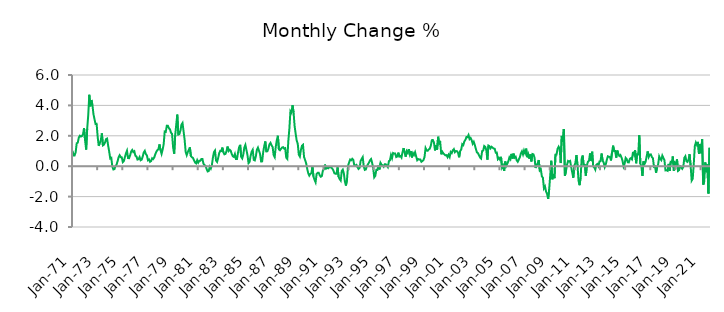
| Category | Series 0 |
|---|---|
| 1971-01-01 | 1.014 |
| 1971-02-01 | 0.711 |
| 1971-03-01 | 0.712 |
| 1971-04-01 | 0.919 |
| 1971-05-01 | 1.51 |
| 1971-06-01 | 1.551 |
| 1971-07-01 | 1.878 |
| 1971-08-01 | 2.005 |
| 1971-09-01 | 1.95 |
| 1971-10-01 | 1.987 |
| 1971-11-01 | 2.104 |
| 1971-12-01 | 2.509 |
| 1972-01-01 | 1.699 |
| 1972-02-01 | 1.094 |
| 1972-03-01 | 2.462 |
| 1972-04-01 | 3.36 |
| 1972-05-01 | 4.697 |
| 1972-06-01 | 3.937 |
| 1972-07-01 | 4.355 |
| 1972-08-01 | 4.026 |
| 1972-09-01 | 3.417 |
| 1972-10-01 | 3.088 |
| 1972-11-01 | 2.774 |
| 1972-12-01 | 2.784 |
| 1973-01-01 | 1.938 |
| 1973-02-01 | 1.343 |
| 1973-03-01 | 1.524 |
| 1973-04-01 | 1.712 |
| 1973-05-01 | 2.158 |
| 1973-06-01 | 1.373 |
| 1973-07-01 | 1.418 |
| 1973-08-01 | 1.551 |
| 1973-09-01 | 1.782 |
| 1973-10-01 | 1.816 |
| 1973-11-01 | 1.359 |
| 1973-12-01 | 0.961 |
| 1974-01-01 | 0.511 |
| 1974-02-01 | 0.548 |
| 1974-03-01 | -0.022 |
| 1974-04-01 | -0.216 |
| 1974-05-01 | -0.191 |
| 1974-06-01 | 0.007 |
| 1974-07-01 | 0.097 |
| 1974-08-01 | 0.326 |
| 1974-09-01 | 0.591 |
| 1974-10-01 | 0.722 |
| 1974-11-01 | 0.594 |
| 1974-12-01 | 0.583 |
| 1975-01-01 | 0.268 |
| 1975-02-01 | 0.337 |
| 1975-03-01 | 0.597 |
| 1975-04-01 | 0.845 |
| 1975-05-01 | 1.017 |
| 1975-06-01 | 0.539 |
| 1975-07-01 | 0.526 |
| 1975-08-01 | 0.722 |
| 1975-09-01 | 0.97 |
| 1975-10-01 | 1.067 |
| 1975-11-01 | 0.93 |
| 1975-12-01 | 0.985 |
| 1976-01-01 | 0.687 |
| 1976-02-01 | 0.643 |
| 1976-03-01 | 0.437 |
| 1976-04-01 | 0.463 |
| 1976-05-01 | 0.603 |
| 1976-06-01 | 0.392 |
| 1976-07-01 | 0.432 |
| 1976-08-01 | 0.636 |
| 1976-09-01 | 0.905 |
| 1976-10-01 | 1.011 |
| 1976-11-01 | 0.8 |
| 1976-12-01 | 0.709 |
| 1977-01-01 | 0.392 |
| 1977-02-01 | 0.448 |
| 1977-03-01 | 0.289 |
| 1977-04-01 | 0.338 |
| 1977-05-01 | 0.521 |
| 1977-06-01 | 0.47 |
| 1977-07-01 | 0.575 |
| 1977-08-01 | 0.784 |
| 1977-09-01 | 0.951 |
| 1977-10-01 | 1.061 |
| 1977-11-01 | 1.111 |
| 1977-12-01 | 1.434 |
| 1978-01-01 | 1.05 |
| 1978-02-01 | 0.811 |
| 1978-03-01 | 1.084 |
| 1978-04-01 | 1.443 |
| 1978-05-01 | 2.28 |
| 1978-06-01 | 2.255 |
| 1978-07-01 | 2.668 |
| 1978-08-01 | 2.665 |
| 1978-09-01 | 2.498 |
| 1978-10-01 | 2.424 |
| 1978-11-01 | 2.207 |
| 1978-12-01 | 2.133 |
| 1979-01-01 | 1.242 |
| 1979-02-01 | 0.823 |
| 1979-03-01 | 2.034 |
| 1979-04-01 | 2.732 |
| 1979-05-01 | 3.394 |
| 1979-06-01 | 2.083 |
| 1979-07-01 | 2.118 |
| 1979-08-01 | 2.335 |
| 1979-09-01 | 2.734 |
| 1979-10-01 | 2.841 |
| 1979-11-01 | 2.3 |
| 1979-12-01 | 1.747 |
| 1980-01-01 | 0.943 |
| 1980-02-01 | 0.726 |
| 1980-03-01 | 0.925 |
| 1980-04-01 | 1.073 |
| 1980-05-01 | 1.242 |
| 1980-06-01 | 0.656 |
| 1980-07-01 | 0.591 |
| 1980-08-01 | 0.543 |
| 1980-09-01 | 0.381 |
| 1980-10-01 | 0.243 |
| 1980-11-01 | 0.186 |
| 1980-12-01 | 0.395 |
| 1981-01-01 | 0.234 |
| 1981-02-01 | 0.354 |
| 1981-03-01 | 0.354 |
| 1981-04-01 | 0.474 |
| 1981-05-01 | 0.478 |
| 1981-06-01 | 0.161 |
| 1981-07-01 | 0.077 |
| 1981-08-01 | 0.019 |
| 1981-09-01 | -0.188 |
| 1981-10-01 | -0.344 |
| 1981-11-01 | -0.317 |
| 1981-12-01 | -0.035 |
| 1982-01-01 | -0.155 |
| 1982-02-01 | 0.068 |
| 1982-03-01 | 0.555 |
| 1982-04-01 | 0.929 |
| 1982-05-01 | 1.031 |
| 1982-06-01 | 0.372 |
| 1982-07-01 | 0.28 |
| 1982-08-01 | 0.532 |
| 1982-09-01 | 0.859 |
| 1982-10-01 | 1.012 |
| 1982-11-01 | 0.998 |
| 1982-12-01 | 1.225 |
| 1983-01-01 | 0.92 |
| 1983-02-01 | 0.783 |
| 1983-03-01 | 0.81 |
| 1983-04-01 | 0.995 |
| 1983-05-01 | 1.293 |
| 1983-06-01 | 1.001 |
| 1983-07-01 | 1.08 |
| 1983-08-01 | 1.015 |
| 1983-09-01 | 0.803 |
| 1983-10-01 | 0.652 |
| 1983-11-01 | 0.611 |
| 1983-12-01 | 0.798 |
| 1984-01-01 | 0.473 |
| 1984-02-01 | 0.478 |
| 1984-03-01 | 0.903 |
| 1984-04-01 | 1.241 |
| 1984-05-01 | 1.404 |
| 1984-06-01 | 0.614 |
| 1984-07-01 | 0.511 |
| 1984-08-01 | 0.774 |
| 1984-09-01 | 1.225 |
| 1984-10-01 | 1.401 |
| 1984-11-01 | 1.068 |
| 1984-12-01 | 0.734 |
| 1985-01-01 | 0.202 |
| 1985-02-01 | 0.279 |
| 1985-03-01 | 0.684 |
| 1985-04-01 | 0.954 |
| 1985-05-01 | 1.079 |
| 1985-06-01 | 0.413 |
| 1985-07-01 | 0.38 |
| 1985-08-01 | 0.656 |
| 1985-09-01 | 1.087 |
| 1985-10-01 | 1.228 |
| 1985-11-01 | 1.02 |
| 1985-12-01 | 0.807 |
| 1986-01-01 | 0.311 |
| 1986-02-01 | 0.317 |
| 1986-03-01 | 0.923 |
| 1986-04-01 | 1.322 |
| 1986-05-01 | 1.629 |
| 1986-06-01 | 0.97 |
| 1986-07-01 | 0.982 |
| 1986-08-01 | 1.161 |
| 1986-09-01 | 1.443 |
| 1986-10-01 | 1.536 |
| 1986-11-01 | 1.373 |
| 1986-12-01 | 1.263 |
| 1987-01-01 | 0.724 |
| 1987-02-01 | 0.595 |
| 1987-03-01 | 1.283 |
| 1987-04-01 | 1.705 |
| 1987-05-01 | 2.003 |
| 1987-06-01 | 1.108 |
| 1987-07-01 | 1.049 |
| 1987-08-01 | 1.142 |
| 1987-09-01 | 1.226 |
| 1987-10-01 | 1.253 |
| 1987-11-01 | 1.16 |
| 1987-12-01 | 1.188 |
| 1988-01-01 | 0.558 |
| 1988-02-01 | 0.478 |
| 1988-03-01 | 1.666 |
| 1988-04-01 | 2.466 |
| 1988-05-01 | 3.62 |
| 1988-06-01 | 3.526 |
| 1988-07-01 | 4.01 |
| 1988-08-01 | 3.546 |
| 1988-09-01 | 2.637 |
| 1988-10-01 | 2.133 |
| 1988-11-01 | 1.68 |
| 1988-12-01 | 1.467 |
| 1989-01-01 | 0.756 |
| 1989-02-01 | 0.634 |
| 1989-03-01 | 1.069 |
| 1989-04-01 | 1.347 |
| 1989-05-01 | 1.408 |
| 1989-06-01 | 0.607 |
| 1989-07-01 | 0.411 |
| 1989-08-01 | 0.192 |
| 1989-09-01 | -0.165 |
| 1989-10-01 | -0.462 |
| 1989-11-01 | -0.618 |
| 1989-12-01 | -0.507 |
| 1990-01-01 | -0.459 |
| 1990-02-01 | -0.019 |
| 1990-03-01 | -0.686 |
| 1990-04-01 | -0.897 |
| 1990-05-01 | -1.058 |
| 1990-06-01 | -0.51 |
| 1990-07-01 | -0.437 |
| 1990-08-01 | -0.428 |
| 1990-09-01 | -0.604 |
| 1990-10-01 | -0.695 |
| 1990-11-01 | -0.649 |
| 1990-12-01 | -0.278 |
| 1991-01-01 | -0.196 |
| 1991-02-01 | 0.105 |
| 1991-03-01 | -0.159 |
| 1991-04-01 | -0.105 |
| 1991-05-01 | -0.139 |
| 1991-06-01 | -0.062 |
| 1991-07-01 | -0.066 |
| 1991-08-01 | -0.093 |
| 1991-09-01 | -0.159 |
| 1991-10-01 | -0.285 |
| 1991-11-01 | -0.467 |
| 1991-12-01 | -0.497 |
| 1992-01-01 | -0.494 |
| 1992-02-01 | -0.076 |
| 1992-03-01 | -0.697 |
| 1992-04-01 | -0.848 |
| 1992-05-01 | -0.944 |
| 1992-06-01 | -0.312 |
| 1992-07-01 | -0.225 |
| 1992-08-01 | -0.473 |
| 1992-09-01 | -1.015 |
| 1992-10-01 | -1.272 |
| 1992-11-01 | -0.873 |
| 1992-12-01 | 0.026 |
| 1993-01-01 | 0.247 |
| 1993-02-01 | 0.437 |
| 1993-03-01 | 0.391 |
| 1993-04-01 | 0.487 |
| 1993-05-01 | 0.413 |
| 1993-06-01 | 0.047 |
| 1993-07-01 | 0.03 |
| 1993-08-01 | 0.082 |
| 1993-09-01 | -0.063 |
| 1993-10-01 | -0.18 |
| 1993-11-01 | -0.118 |
| 1993-12-01 | 0.35 |
| 1994-01-01 | 0.48 |
| 1994-02-01 | 0.595 |
| 1994-03-01 | -0.023 |
| 1994-04-01 | -0.241 |
| 1994-05-01 | -0.212 |
| 1994-06-01 | 0.019 |
| 1994-07-01 | 0.12 |
| 1994-08-01 | 0.247 |
| 1994-09-01 | 0.391 |
| 1994-10-01 | 0.472 |
| 1994-11-01 | 0.222 |
| 1994-12-01 | -0.131 |
| 1995-01-01 | -0.733 |
| 1995-02-01 | -0.635 |
| 1995-03-01 | -0.24 |
| 1995-04-01 | -0.251 |
| 1995-05-01 | 0.043 |
| 1995-06-01 | -0.212 |
| 1995-07-01 | 0.218 |
| 1995-08-01 | 0.097 |
| 1995-09-01 | 0.057 |
| 1995-10-01 | -0.036 |
| 1995-11-01 | 0.126 |
| 1995-12-01 | 0.123 |
| 1996-01-01 | 0.036 |
| 1996-02-01 | -0.061 |
| 1996-03-01 | 0.33 |
| 1996-04-01 | 0.389 |
| 1996-05-01 | 0.736 |
| 1996-06-01 | 0.535 |
| 1996-07-01 | 0.868 |
| 1996-08-01 | 0.833 |
| 1996-09-01 | 0.834 |
| 1996-10-01 | 0.603 |
| 1996-11-01 | 0.635 |
| 1996-12-01 | 0.892 |
| 1997-01-01 | 0.634 |
| 1997-02-01 | 0.672 |
| 1997-03-01 | 0.57 |
| 1997-04-01 | 0.919 |
| 1997-05-01 | 1.19 |
| 1997-06-01 | 0.893 |
| 1997-07-01 | 0.625 |
| 1997-08-01 | 0.99 |
| 1997-09-01 | 0.877 |
| 1997-10-01 | 1.126 |
| 1997-11-01 | 0.779 |
| 1997-12-01 | 0.981 |
| 1998-01-01 | 0.576 |
| 1998-02-01 | 0.861 |
| 1998-03-01 | 0.744 |
| 1998-04-01 | 0.917 |
| 1998-05-01 | 0.646 |
| 1998-06-01 | 0.394 |
| 1998-07-01 | 0.47 |
| 1998-08-01 | 0.438 |
| 1998-09-01 | 0.441 |
| 1998-10-01 | 0.291 |
| 1998-11-01 | 0.339 |
| 1998-12-01 | 0.406 |
| 1999-01-01 | 0.599 |
| 1999-02-01 | 1.189 |
| 1999-03-01 | 1.036 |
| 1999-04-01 | 1.017 |
| 1999-05-01 | 1.102 |
| 1999-06-01 | 1.154 |
| 1999-07-01 | 1.343 |
| 1999-08-01 | 1.715 |
| 1999-09-01 | 1.719 |
| 1999-10-01 | 1.552 |
| 1999-11-01 | 1.038 |
| 1999-12-01 | 1.38 |
| 2000-01-01 | 1.085 |
| 2000-02-01 | 1.936 |
| 2000-03-01 | 1.491 |
| 2000-04-01 | 1.566 |
| 2000-05-01 | 0.781 |
| 2000-06-01 | 0.949 |
| 2000-07-01 | 0.839 |
| 2000-08-01 | 0.775 |
| 2000-09-01 | 0.714 |
| 2000-10-01 | 0.729 |
| 2000-11-01 | 0.596 |
| 2000-12-01 | 0.754 |
| 2001-01-01 | 0.606 |
| 2001-02-01 | 0.935 |
| 2001-03-01 | 0.867 |
| 2001-04-01 | 1.055 |
| 2001-05-01 | 1.127 |
| 2001-06-01 | 0.924 |
| 2001-07-01 | 0.998 |
| 2001-08-01 | 0.985 |
| 2001-09-01 | 0.883 |
| 2001-10-01 | 0.588 |
| 2001-11-01 | 0.997 |
| 2001-12-01 | 1.094 |
| 2002-01-01 | 1.445 |
| 2002-02-01 | 1.384 |
| 2002-03-01 | 1.631 |
| 2002-04-01 | 1.728 |
| 2002-05-01 | 1.918 |
| 2002-06-01 | 1.906 |
| 2002-07-01 | 2.048 |
| 2002-08-01 | 1.783 |
| 2002-09-01 | 1.859 |
| 2002-10-01 | 1.71 |
| 2002-11-01 | 1.477 |
| 2002-12-01 | 1.602 |
| 2003-01-01 | 1.407 |
| 2003-02-01 | 1.139 |
| 2003-03-01 | 0.91 |
| 2003-04-01 | 0.863 |
| 2003-05-01 | 0.726 |
| 2003-06-01 | 0.579 |
| 2003-07-01 | 0.508 |
| 2003-08-01 | 0.993 |
| 2003-09-01 | 1.027 |
| 2003-10-01 | 1.329 |
| 2003-11-01 | 1.273 |
| 2003-12-01 | 1.053 |
| 2004-01-01 | 0.433 |
| 2004-02-01 | 1.358 |
| 2004-03-01 | 1.317 |
| 2004-04-01 | 1.179 |
| 2004-05-01 | 1.278 |
| 2004-06-01 | 1.218 |
| 2004-07-01 | 1.163 |
| 2004-08-01 | 1.146 |
| 2004-09-01 | 0.887 |
| 2004-10-01 | 0.892 |
| 2004-11-01 | 0.464 |
| 2004-12-01 | 0.546 |
| 2005-01-01 | 0.433 |
| 2005-02-01 | 0.615 |
| 2005-03-01 | -0.094 |
| 2005-04-01 | 0.035 |
| 2005-05-01 | -0.308 |
| 2005-06-01 | 0.31 |
| 2005-07-01 | 0.014 |
| 2005-08-01 | 0.163 |
| 2005-09-01 | 0.324 |
| 2005-10-01 | 0.577 |
| 2005-11-01 | 0.466 |
| 2005-12-01 | 0.812 |
| 2006-01-01 | 0.5 |
| 2006-02-01 | 0.828 |
| 2006-03-01 | 0.563 |
| 2006-04-01 | 0.621 |
| 2006-05-01 | 0.386 |
| 2006-06-01 | 0.291 |
| 2006-07-01 | 0.438 |
| 2006-08-01 | 0.591 |
| 2006-09-01 | 0.848 |
| 2006-10-01 | 0.979 |
| 2006-11-01 | 0.775 |
| 2006-12-01 | 1.037 |
| 2007-01-01 | 0.858 |
| 2007-02-01 | 1.157 |
| 2007-03-01 | 0.591 |
| 2007-04-01 | 0.791 |
| 2007-05-01 | 0.495 |
| 2007-06-01 | 0.773 |
| 2007-07-01 | 0.314 |
| 2007-08-01 | 0.802 |
| 2007-09-01 | 0.779 |
| 2007-10-01 | 0.566 |
| 2007-11-01 | -0.121 |
| 2007-12-01 | 0.07 |
| 2008-01-01 | 0.193 |
| 2008-02-01 | 0.407 |
| 2008-03-01 | -0.27 |
| 2008-04-01 | -0.198 |
| 2008-05-01 | -0.666 |
| 2008-06-01 | -0.763 |
| 2008-07-01 | -1.456 |
| 2008-08-01 | -1.333 |
| 2008-09-01 | -1.666 |
| 2008-10-01 | -1.827 |
| 2008-11-01 | -2.152 |
| 2008-12-01 | -1.511 |
| 2009-01-01 | -0.593 |
| 2009-02-01 | 0.356 |
| 2009-03-01 | -0.862 |
| 2009-04-01 | -0.536 |
| 2009-05-01 | -0.786 |
| 2009-06-01 | 0.762 |
| 2009-07-01 | 0.77 |
| 2009-08-01 | 1.139 |
| 2009-09-01 | 1.284 |
| 2009-10-01 | 1.145 |
| 2009-11-01 | 0.204 |
| 2009-12-01 | 1.994 |
| 2010-01-01 | 1.613 |
| 2010-02-01 | 2.445 |
| 2010-03-01 | -0.631 |
| 2010-04-01 | -0.337 |
| 2010-05-01 | 0.08 |
| 2010-06-01 | 0.344 |
| 2010-07-01 | 0.307 |
| 2010-08-01 | 0.345 |
| 2010-09-01 | -0.055 |
| 2010-10-01 | -0.41 |
| 2010-11-01 | -0.762 |
| 2010-12-01 | 0.039 |
| 2011-01-01 | 0.213 |
| 2011-02-01 | 0.73 |
| 2011-03-01 | 0.086 |
| 2011-04-01 | -0.954 |
| 2011-05-01 | -1.249 |
| 2011-06-01 | -0.74 |
| 2011-07-01 | 0.505 |
| 2011-08-01 | 0.701 |
| 2011-09-01 | -0.047 |
| 2011-10-01 | 0.117 |
| 2011-11-01 | -0.617 |
| 2011-12-01 | 0.055 |
| 2012-01-01 | 0.295 |
| 2012-02-01 | 0.36 |
| 2012-03-01 | 0.843 |
| 2012-04-01 | 0.364 |
| 2012-05-01 | 0.952 |
| 2012-06-01 | -0.019 |
| 2012-07-01 | -0.072 |
| 2012-08-01 | -0.223 |
| 2012-09-01 | 0.09 |
| 2012-10-01 | 0.146 |
| 2012-11-01 | 0.01 |
| 2012-12-01 | 0.315 |
| 2013-01-01 | 0.332 |
| 2013-02-01 | 0.833 |
| 2013-03-01 | 0.377 |
| 2013-04-01 | 0.245 |
| 2013-05-01 | -0.058 |
| 2013-06-01 | 0.126 |
| 2013-07-01 | 0.41 |
| 2013-08-01 | 0.651 |
| 2013-09-01 | 0.62 |
| 2013-10-01 | 0.603 |
| 2013-11-01 | 0.38 |
| 2013-12-01 | 0.926 |
| 2014-01-01 | 1.351 |
| 2014-02-01 | 0.99 |
| 2014-03-01 | 1.002 |
| 2014-04-01 | 0.559 |
| 2014-05-01 | 1.028 |
| 2014-06-01 | 0.79 |
| 2014-07-01 | 0.675 |
| 2014-08-01 | 0.734 |
| 2014-09-01 | 0.578 |
| 2014-10-01 | 0.359 |
| 2014-11-01 | -0.016 |
| 2014-12-01 | 0.161 |
| 2015-01-01 | 0.547 |
| 2015-02-01 | 0.467 |
| 2015-03-01 | 0.257 |
| 2015-04-01 | 0.25 |
| 2015-05-01 | 0.484 |
| 2015-06-01 | 0.532 |
| 2015-07-01 | 0.454 |
| 2015-08-01 | 0.94 |
| 2015-09-01 | 0.754 |
| 2015-10-01 | 1.045 |
| 2015-11-01 | 0.196 |
| 2015-12-01 | 0.79 |
| 2016-01-01 | 0.777 |
| 2016-02-01 | 2.042 |
| 2016-03-01 | 0.162 |
| 2016-04-01 | 0.005 |
| 2016-05-01 | -0.638 |
| 2016-06-01 | 0.315 |
| 2016-07-01 | 0.149 |
| 2016-08-01 | 0.276 |
| 2016-09-01 | 0.638 |
| 2016-10-01 | 0.971 |
| 2016-11-01 | 0.611 |
| 2016-12-01 | 0.773 |
| 2017-01-01 | 0.778 |
| 2017-02-01 | 0.608 |
| 2017-03-01 | 0.525 |
| 2017-04-01 | -0.033 |
| 2017-05-01 | -0.003 |
| 2017-06-01 | -0.431 |
| 2017-07-01 | -0.06 |
| 2017-08-01 | 0.117 |
| 2017-09-01 | 0.643 |
| 2017-10-01 | 0.49 |
| 2017-11-01 | 0.401 |
| 2017-12-01 | 0.694 |
| 2018-01-01 | 0.543 |
| 2018-02-01 | 0.408 |
| 2018-03-01 | -0.275 |
| 2018-04-01 | -0.266 |
| 2018-05-01 | -0.302 |
| 2018-06-01 | 0.152 |
| 2018-07-01 | -0.316 |
| 2018-08-01 | 0.283 |
| 2018-09-01 | 0.257 |
| 2018-10-01 | 0.643 |
| 2018-11-01 | -0.297 |
| 2018-12-01 | 0.233 |
| 2019-01-01 | 0.149 |
| 2019-02-01 | 0.449 |
| 2019-03-01 | -0.311 |
| 2019-04-01 | -0.253 |
| 2019-05-01 | -0.005 |
| 2019-06-01 | -0.066 |
| 2019-07-01 | -0.17 |
| 2019-08-01 | -0.053 |
| 2019-09-01 | 0.55 |
| 2019-10-01 | 0.654 |
| 2019-11-01 | 0.326 |
| 2019-12-01 | 0.284 |
| 2020-01-01 | 0.422 |
| 2020-02-01 | 0.788 |
| 2020-03-01 | 0.046 |
| 2020-04-01 | -0.944 |
| 2020-05-01 | -0.825 |
| 2020-06-01 | 0.141 |
| 2020-07-01 | 1.322 |
| 2020-08-01 | 1.559 |
| 2020-09-01 | 1.403 |
| 2020-10-01 | 1.599 |
| 2020-11-01 | 0.813 |
| 2020-12-01 | 1.437 |
| 2021-01-01 | 0.856 |
| 2021-02-01 | 1.773 |
| 2021-03-01 | -1.21 |
| 2021-04-01 | -0.998 |
| 2021-05-01 | 0.249 |
| 2021-06-01 | -0.392 |
| 2021-07-01 | 0.117 |
| 2021-08-01 | -1.798 |
| 2021-09-01 | 1.213 |